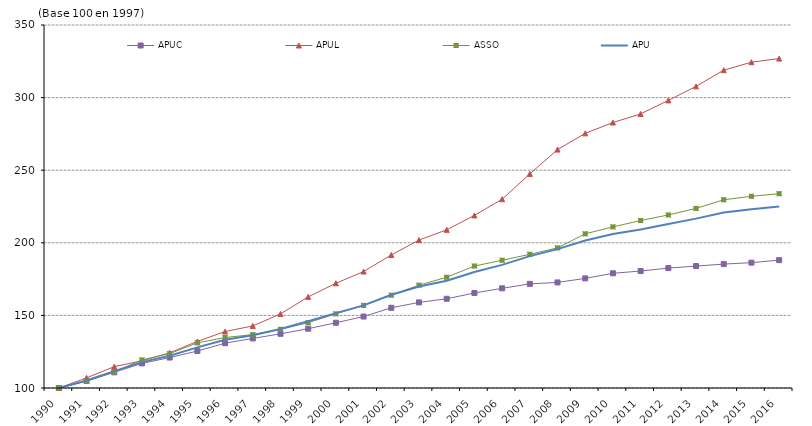
| Category | APUC | APUL | ASSO | APU |
|---|---|---|---|---|
| 1990.0 | 100 | 100 | 100 | 100 |
| 1991.0 | 104.788 | 106.977 | 104.734 | 105.199 |
| 1992.0 | 110.808 | 114.716 | 111.138 | 111.636 |
| 1993.0 | 116.934 | 118.7 | 119.345 | 117.808 |
| 1994.0 | 120.969 | 124.242 | 123.689 | 122.202 |
| 1995.0 | 125.455 | 132.096 | 131.11 | 127.987 |
| 1996.0 | 130.855 | 138.867 | 134.761 | 133.265 |
| 1997.0 | 134.143 | 142.75 | 136.741 | 136.379 |
| 1998.0 | 137.33 | 151.001 | 140.446 | 140.659 |
| 1999.0 | 140.856 | 162.778 | 145.021 | 146.01 |
| 2000.0 | 144.934 | 172.099 | 151.089 | 151.541 |
| 2001.0 | 149.218 | 180.207 | 156.881 | 156.896 |
| 2002.0 | 155.25 | 191.606 | 163.915 | 164.186 |
| 2003.0 | 158.954 | 201.87 | 170.813 | 169.863 |
| 2004.0 | 161.459 | 208.919 | 176.27 | 173.898 |
| 2005.0 | 165.434 | 218.847 | 183.999 | 179.852 |
| 2006.0 | 168.647 | 230.016 | 187.98 | 184.771 |
| 2007.0 | 171.713 | 247.44 | 192.068 | 190.836 |
| 2008.0 | 172.702 | 264.193 | 196.501 | 195.631 |
| 2009.0 | 175.494 | 275.38 | 206.193 | 201.569 |
| 2010.0 | 179.006 | 282.83 | 210.964 | 206.119 |
| 2011.0 | 180.536 | 288.757 | 215.333 | 209.126 |
| 2012.0 | 182.588 | 298.073 | 219.188 | 212.979 |
| 2013.0 | 183.964 | 307.737 | 223.682 | 216.645 |
| 2014.0 | 185.338 | 318.893 | 229.634 | 220.92 |
| 2015.0 | 186.325 | 324.372 | 232.021 | 223.084 |
| 2016.0 | 188.053 | 326.89 | 233.815 | 224.979 |